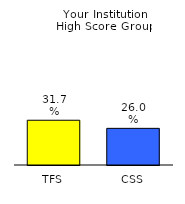
| Category | Series 0 |
|---|---|
| TFS | 0.317 |
| CSS | 0.26 |